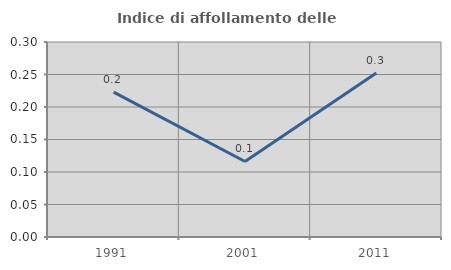
| Category | Indice di affollamento delle abitazioni  |
|---|---|
| 1991.0 | 0.223 |
| 2001.0 | 0.116 |
| 2011.0 | 0.252 |